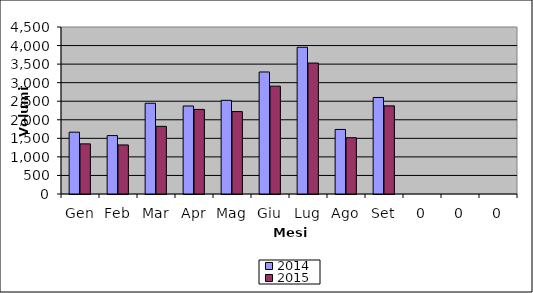
| Category | 2014 | 2015 |
|---|---|---|
| Gen | 1666 | 1351 |
| Feb | 1574 | 1322 |
| Mar | 2445 | 1823 |
| Apr | 2371 | 2279 |
| Mag | 2524 | 2221 |
| Giu | 3288 | 2906 |
| Lug | 3954 | 3528 |
| Ago | 1739 | 1516 |
| Set | 2601 | 2375 |
| 0 | 0 | 0 |
| 0 | 0 | 0 |
| 0 | 0 | 0 |